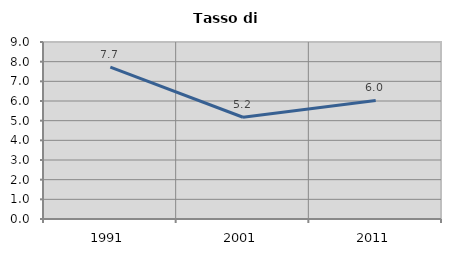
| Category | Tasso di disoccupazione   |
|---|---|
| 1991.0 | 7.719 |
| 2001.0 | 5.172 |
| 2011.0 | 6.03 |